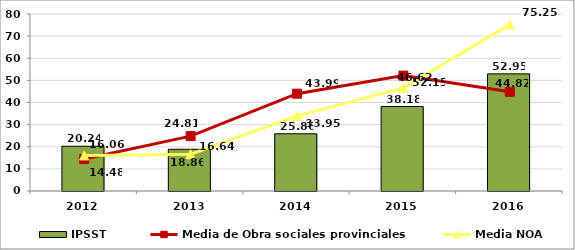
| Category | IPSST |
|---|---|
| 2012.0 | 20.24 |
| 2013.0 | 18.86 |
| 2014.0 | 25.86 |
| 2015.0 | 38.18 |
| 2016.0 | 52.95 |